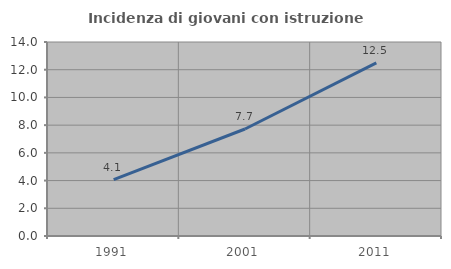
| Category | Incidenza di giovani con istruzione universitaria |
|---|---|
| 1991.0 | 4.072 |
| 2001.0 | 7.722 |
| 2011.0 | 12.5 |